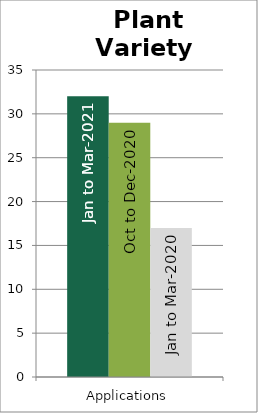
| Category | Jan to Mar-2021 | Oct to Dec-2020 | Jan to Mar-2020 |
|---|---|---|---|
| Applications | 32 | 29 | 17 |